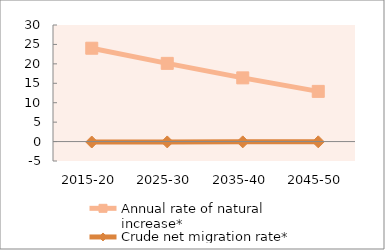
| Category | Annual rate of natural increase* | Crude net migration rate* |
|---|---|---|
| 2015-20 | 24.021 | -0.114 |
| 2025-30 | 20.126 | -0.092 |
| 2035-40 | 16.394 | -0.076 |
| 2045-50 | 12.916 | -0.066 |